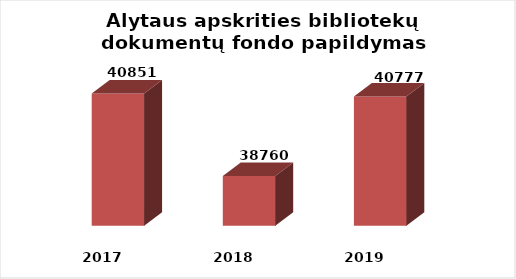
| Category | Series 0 |
|---|---|
| 2017.0 | 40851 |
| 2018.0 | 38760 |
| 2019.0 | 40777 |